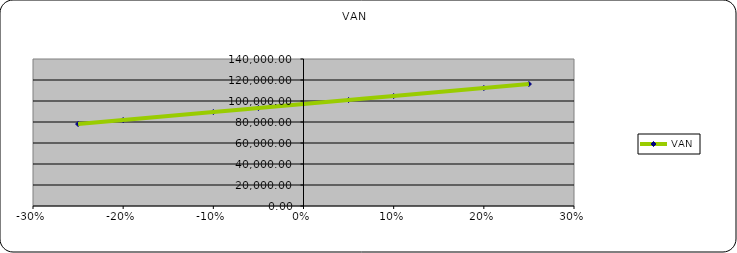
| Category | VAN |
|---|---|
| -0.25 | 78038.4 |
| -0.2 | 81849.39 |
| -0.1 | 89471.37 |
| -0.05 | 93282.36 |
| 0.0 | 97093.35 |
| 0.05 | 100904.34 |
| 0.1 | 104715.33 |
| 0.2 | 112337.32 |
| 0.25 | 116148.31 |